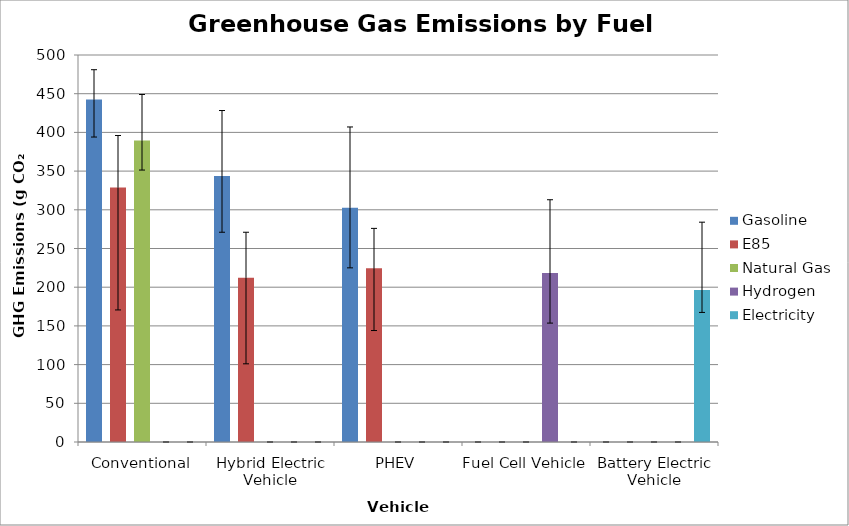
| Category | Gasoline | E85 | Natural Gas | Hydrogen | Electricity |
|---|---|---|---|---|---|
| Conventional | 442.587 | 328.855 | 389.425 | 0 | 0 |
| Hybrid Electric Vehicle | 343.814 | 212.269 | 0 | 0 | 0 |
| PHEV | 302.714 | 224.5 | 0 | 0 | 0 |
| Fuel Cell Vehicle | 0 | 0 | 0 | 218.444 | 0 |
| Battery Electric Vehicle | 0 | 0 | 0 | 0 | 196.301 |